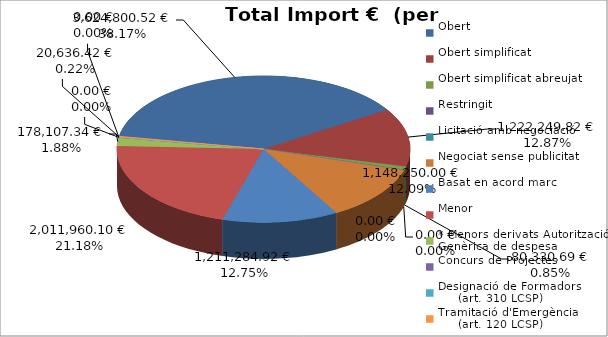
| Category | Total preu
(amb IVA) |
|---|---|
| Obert | 3624800.52 |
| Obert simplificat | 1222249.82 |
| Obert simplificat abreujat | 80330.69 |
| Restringit | 0 |
| Licitació amb negociació | 0 |
| Negociat sense publicitat | 1148250 |
| Basat en acord marc | 1211284.92 |
| Menor | 2011960.1 |
| * Menors derivats Autorització Genèrica de despesa | 178107.34 |
| Concurs de Projectes | 0 |
| Designació de Formadors
     (art. 310 LCSP) | 0 |
| Tramitació d'Emergència
     (art. 120 LCSP) | 20636.42 |